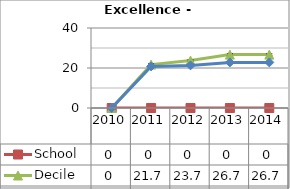
| Category | School  | Decile | National |
|---|---|---|---|
| 2010.0 | 0 | 0 | 0 |
| 2011.0 | 0 | 21.7 | 20.8 |
| 2012.0 | 0 | 23.7 | 21.3 |
| 2013.0 | 0 | 26.7 | 22.8 |
| 2014.0 | 0 | 26.7 | 22.8 |